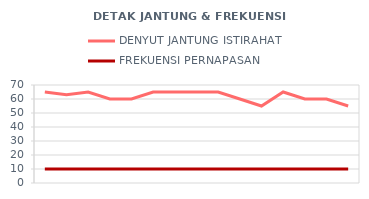
| Category | DENYUT JANTUNG ISTIRAHAT | FREKUENSI PERNAPASAN |
|---|---|---|
| 6/1/12 | 65 | 10 |
| 6/2/12 | 63 | 10 |
| 6/3/12 | 65 | 10 |
| 6/4/12 | 60 | 10 |
| 6/5/12 | 60 | 10 |
| 6/6/12 | 65 | 10 |
| 6/7/12 | 65 | 10 |
| 6/8/12 | 65 | 10 |
| 6/9/12 | 65 | 10 |
| 6/10/12 | 60 | 10 |
| 6/11/12 | 55 | 10 |
| 6/12/12 | 65 | 10 |
| 6/13/12 | 60 | 10 |
| 6/14/12 | 60 | 10 |
| 6/15/12 | 55 | 10 |